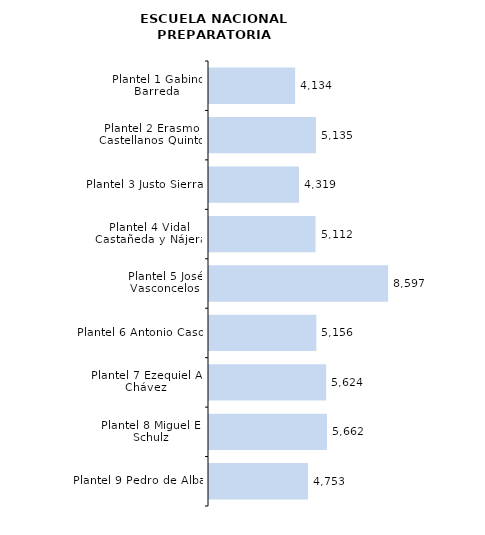
| Category | Series 0 |
|---|---|
| Plantel 9 Pedro de Alba | 4753 |
| Plantel 8 Miguel E. Schulz | 5662 |
| Plantel 7 Ezequiel A. Chávez | 5624 |
| Plantel 6 Antonio Caso | 5156 |
| Plantel 5 José Vasconcelos | 8597 |
| Plantel 4 Vidal Castañeda y Nájera | 5112 |
| Plantel 3 Justo Sierra | 4319 |
| Plantel 2 Erasmo Castellanos Quinto | 5135 |
| Plantel 1 Gabino Barreda | 4134 |